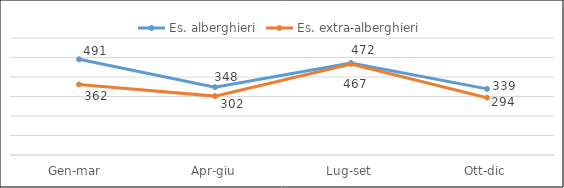
| Category | Es. alberghieri | Es. extra-alberghieri |
|---|---|---|
| Gen-mar  | 491 | 362 |
| Apr-giu | 348 | 302 |
| Lug-set | 472 | 467 |
| Ott-dic | 339 | 294 |